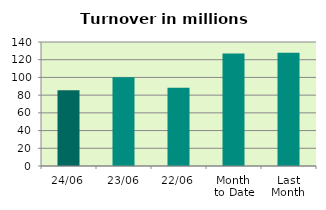
| Category | Series 0 |
|---|---|
| 24/06 | 85.505 |
| 23/06 | 100.312 |
| 22/06 | 88.234 |
| Month 
to Date | 127.143 |
| Last
Month | 127.932 |